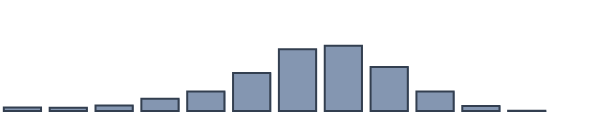
| Category | Series 0 |
|---|---|
| 0 | 1.261 |
| 1 | 1.13 |
| 2 | 2 |
| 3 | 4.435 |
| 4 | 7.043 |
| 5 | 13.652 |
| 6 | 22.217 |
| 7 | 23.478 |
| 8 | 15.87 |
| 9 | 7 |
| 10 | 1.826 |
| 11 | 0.087 |
| 12 | 0 |